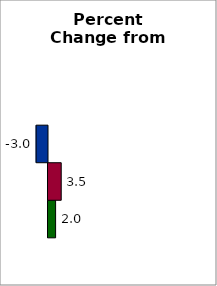
| Category | 50 states and D.C. | SREB states | State |
|---|---|---|---|
| 0 | 2 | 3.479 | -3 |